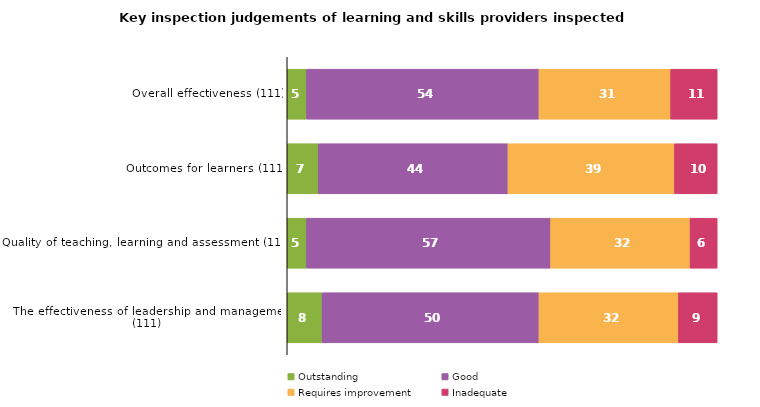
| Category | Outstanding | Good | Requires improvement | Inadequate |
|---|---|---|---|---|
| Overall effectiveness (111) | 4.505 | 54.054 | 30.631 | 10.811 |
| Outcomes for learners (111) | 7.207 | 44.144 | 38.739 | 9.91 |
| Quality of teaching, learning and assessment (111) | 4.505 | 56.757 | 32.432 | 6.306 |
| The effectiveness of leadership and management (111) | 8.108 | 50.45 | 32.432 | 9.009 |